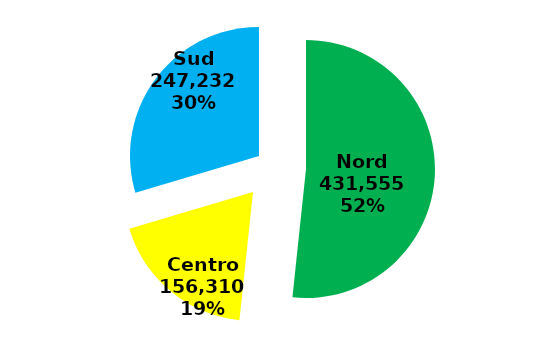
| Category | Series 0 |
|---|---|
| Nord | 431555 |
| Centro | 156310 |
| Sud | 247232 |